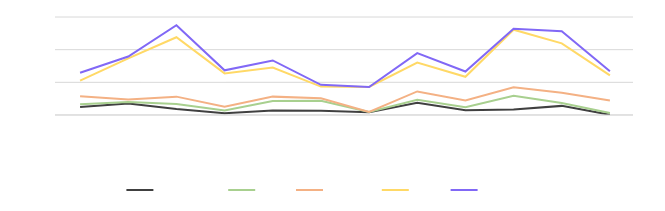
| Category | Germany | USA | France | Italy | Norway |
|---|---|---|---|---|---|
| January | 48688 | 16907 | 49652 | 95240 | 48600 |
| February | 70667 | 8349 | 16173 | 251415 | 11497 |
| March | 37433 | 30120 | 44875 | 363771 | 73815 |
| April | 10942 | 16161 | 23572 | 203945 | 19067 |
| May | 27962 | 57318 | 27213 | 177849 | 43585 |
| June | 25807 | 61968 | 15257 | 71034 | 10551 |
| July | 16920 | 1603 | 0 | 153176 | 0 |
| August | 74402 | 19000 | 50852 | 176995 | 57665 |
| September | 29366 | 18078 | 41228 | 145350 | 32067 |
| October | 34081 | 83660 | 51472 | 353094 | 5072 |
| November | 55847 | 18124 | 62872 | 302046 | 73508 |
| December | 1499 | 10157 | 77093 | 153456 | 25667 |